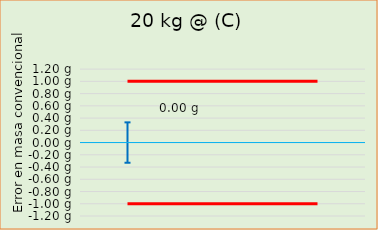
| Category | Error en masa convencional  |  ± EMP |
|---|---|---|
| 0 |  | -1 |
| 1 |  | -1 |
| 2 |  | -1 |